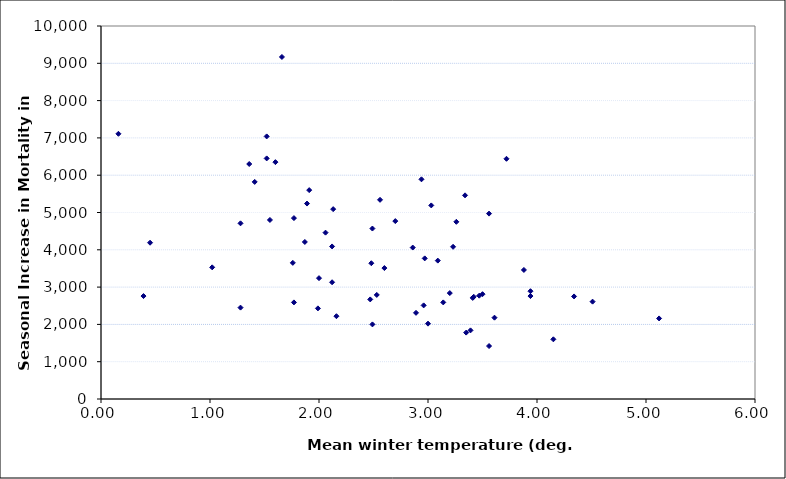
| Category | Seas Incr. Mort. |
|---|---|
| 1.89 | 5240 |
| 2.94 | 5890 |
| 2.7 | 4770 |
| 1.41 | 5820 |
| 1.52 | 6450 |
| 3.47 | 2770 |
| 2.06 | 4460 |
| 1.66 | 9170 |
| 2.12 | 4090 |
| 2.56 | 5340 |
| 2.13 | 5090 |
| 0.16 | 7110 |
| 3.09 | 3710 |
| 1.87 | 4210 |
| 1.6 | 6350 |
| 3.0 | 2020 |
| 1.91 | 5600 |
| 1.55 | 4800 |
| 1.52 | 7040 |
| 3.41 | 2710 |
| 3.56 | 4970 |
| 3.23 | 4080 |
| 3.5 | 2810 |
| 3.88 | 3460 |
| 3.72 | 6440 |
| 1.02 | 3530 |
| 1.77 | 4850 |
| 0.45 | 4190 |
| 2.47 | 2670 |
| 2.97 | 3770 |
| 1.36 | 6300 |
| 2.49 | 4570 |
| 2.53 | 2790 |
| 2.12 | 3130 |
| 1.28 | 4710 |
| 2.0 | 3240 |
| 3.14 | 2590 |
| 5.12 | 2160 |
| 3.34 | 5460 |
| 1.99 | 2430 |
| 3.94 | 2890 |
| 3.42 | 2740 |
| 1.77 | 2590 |
| 2.89 | 2310 |
| 1.76 | 3650 |
| 2.48 | 3640 |
| 4.51 | 2610 |
| 3.26 | 4750 |
| 3.03 | 5190 |
| 2.16 | 2220 |
| 3.39 | 1840 |
| 2.96 | 2510 |
| 3.2 | 2840 |
| 3.94 | 2760 |
| 3.35 | 1780 |
| 4.34 | 2750 |
| 3.61 | 2180 |
| 2.6 | 3510 |
| 0.39 | 2760 |
| 1.28 | 2450 |
| 3.56 | 1420 |
| 2.49 | 2000 |
| 4.15 | 1600 |
| 2.86 | 4060 |